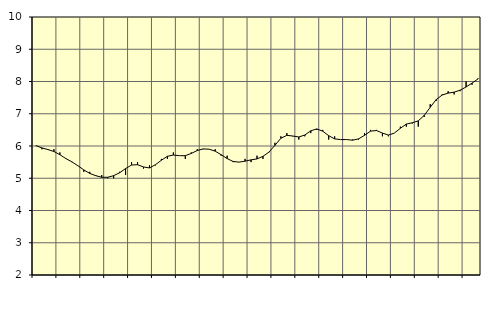
| Category | Piggar | Information och kommunikation, SNI 58-63 |
|---|---|---|
| nan | 6 | 6.01 |
| 1.0 | 5.9 | 5.94 |
| 1.0 | 5.9 | 5.89 |
| 1.0 | 5.9 | 5.83 |
| nan | 5.8 | 5.73 |
| 2.0 | 5.6 | 5.61 |
| 2.0 | 5.5 | 5.51 |
| 2.0 | 5.4 | 5.39 |
| nan | 5.2 | 5.26 |
| 3.0 | 5.2 | 5.15 |
| 3.0 | 5.1 | 5.08 |
| 3.0 | 5.1 | 5.03 |
| nan | 5 | 5.03 |
| 4.0 | 5 | 5.08 |
| 4.0 | 5.2 | 5.17 |
| 4.0 | 5.1 | 5.3 |
| nan | 5.5 | 5.41 |
| 5.0 | 5.5 | 5.42 |
| 5.0 | 5.3 | 5.35 |
| 5.0 | 5.4 | 5.32 |
| nan | 5.4 | 5.42 |
| 6.0 | 5.6 | 5.56 |
| 6.0 | 5.6 | 5.68 |
| 6.0 | 5.8 | 5.72 |
| nan | 5.7 | 5.7 |
| 7.0 | 5.6 | 5.7 |
| 7.0 | 5.8 | 5.77 |
| 7.0 | 5.9 | 5.86 |
| nan | 5.9 | 5.91 |
| 8.0 | 5.9 | 5.9 |
| 8.0 | 5.9 | 5.84 |
| 8.0 | 5.7 | 5.73 |
| nan | 5.7 | 5.61 |
| 9.0 | 5.5 | 5.52 |
| 9.0 | 5.5 | 5.5 |
| 9.0 | 5.6 | 5.53 |
| nan | 5.5 | 5.57 |
| 10.0 | 5.7 | 5.6 |
| 10.0 | 5.6 | 5.68 |
| 10.0 | 5.8 | 5.81 |
| nan | 6.1 | 6.02 |
| 11.0 | 6.3 | 6.24 |
| 11.0 | 6.4 | 6.33 |
| 11.0 | 6.3 | 6.31 |
| nan | 6.2 | 6.28 |
| 12.0 | 6.3 | 6.34 |
| 12.0 | 6.4 | 6.47 |
| 12.0 | 6.5 | 6.53 |
| nan | 6.5 | 6.46 |
| 13.0 | 6.2 | 6.32 |
| 13.0 | 6.3 | 6.22 |
| 13.0 | 6.2 | 6.2 |
| nan | 6.2 | 6.2 |
| 14.0 | 6.2 | 6.18 |
| 14.0 | 6.2 | 6.22 |
| 14.0 | 6.4 | 6.33 |
| nan | 6.5 | 6.46 |
| 15.0 | 6.5 | 6.48 |
| 15.0 | 6.3 | 6.4 |
| 15.0 | 6.3 | 6.34 |
| nan | 6.4 | 6.4 |
| 16.0 | 6.6 | 6.55 |
| 16.0 | 6.6 | 6.68 |
| 16.0 | 6.7 | 6.72 |
| nan | 6.6 | 6.78 |
| 17.0 | 6.9 | 6.95 |
| 17.0 | 7.3 | 7.2 |
| 17.0 | 7.4 | 7.44 |
| nan | 7.6 | 7.58 |
| 18.0 | 7.7 | 7.64 |
| 18.0 | 7.6 | 7.67 |
| 18.0 | 7.7 | 7.73 |
| nan | 8 | 7.83 |
| 19.0 | 7.9 | 7.95 |
| 19.0 | 8.1 | 8.08 |